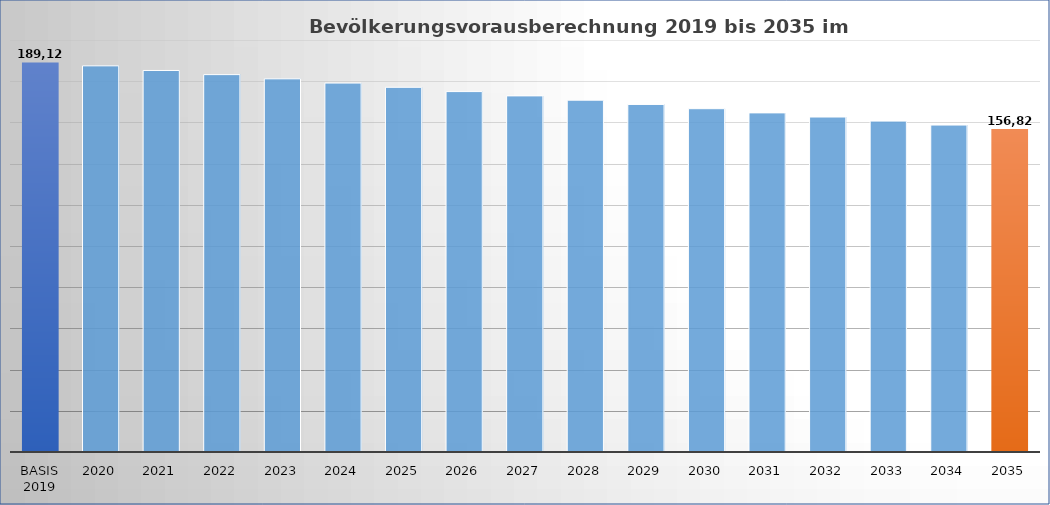
| Category | Series 0 |
|---|---|
| 0 | 189125 |
| 1 | 187457 |
| 2 | 185206 |
| 3 | 183192 |
| 4 | 181153 |
| 5 | 179103 |
| 6 | 177038 |
| 7 | 174957 |
| 8 | 172873 |
| 9 | 170786 |
| 10 | 168712 |
| 11 | 166656 |
| 12 | 164617 |
| 13 | 162608 |
| 14 | 160635 |
| 15 | 158710 |
| 16 | 156820 |